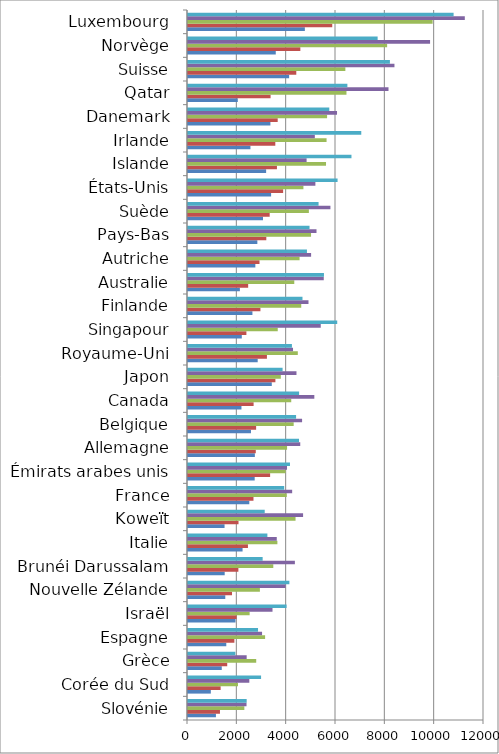
| Category | Series 0 | Series 1 | Series 2 | Series 3 | Series 4 |
|---|---|---|---|---|---|
| Slovénie | 1132.376 | 1296.104 | 2284.392 | 2372.633 | 2378.67 |
| Corée du Sud | 925.148 | 1323.165 | 2026.015 | 2486.071 | 2962.338 |
| Grèce | 1368.835 | 1590.054 | 2765.424 | 2378.302 | 1920.806 |
| Espagne | 1552.224 | 1880.104 | 3125.885 | 3002.596 | 2839.119 |
| Israël | 1925.207 | 1970.043 | 2498.858 | 3425.917 | 3996.221 |
| Nouvelle Zélande | 1511.457 | 1784.429 | 2914.877 | 3956.713 | 4110.66 |
| Brunéi Darussalam | 1487.866 | 2042.18 | 3457.921 | 4333.171 | 3026.523 |
| Italie | 2212.311 | 2430.632 | 3623.842 | 3598.587 | 3218.186 |
| Koweït | 1482.174 | 2047.66 | 4359.917 | 4665.524 | 3110.297 |
| France | 2485.644 | 2654.769 | 4004.505 | 4222.859 | 3899.702 |
| Émirats arabes unis | 2703.795 | 3329.504 | 3958.499 | 4013.92 | 4133.885 |
| Allemagne | 2710.429 | 2748.136 | 4016.432 | 4550.583 | 4500.836 |
| Belgique | 2552.636 | 2761.962 | 4284.321 | 4625.3 | 4381.613 |
| Canada | 2167.25 | 2659.819 | 4185.698 | 5121.322 | 4504.232 |
| Japon | 3396.655 | 3543.169 | 3762.531 | 4397.457 | 3834.738 |
| Royaume-Uni | 2825.391 | 3199.741 | 4451.992 | 4257.854 | 4212.807 |
| Singapour | 2181.009 | 2367.473 | 3638.353 | 5381.903 | 6049.715 |
| Finlande | 2611.791 | 2936.034 | 4590.96 | 4884.871 | 4641.347 |
| Australie | 2103.369 | 2439.374 | 4308.432 | 5504.047 | 5511.862 |
| Autriche | 2730.415 | 2899.424 | 4524.028 | 4990.832 | 4822.094 |
| Pays-Bas | 2811.243 | 3174.853 | 4988.293 | 5209.518 | 4927.248 |
| Suède | 3040.294 | 3311.63 | 4900.186 | 5774.091 | 5293.253 |
| États-Unis | 3368.847 | 3856.422 | 4678.963 | 5164.225 | 6064.248 |
| Islande | 3167.413 | 3605.75 | 5595.238 | 4808.129 | 6626.977 |
| Irlande | 2531.215 | 3539.679 | 5617.424 | 5141.619 | 7024.47 |
| Danemark | 3340.433 | 3636.311 | 5638.877 | 6041.586 | 5727.974 |
| Qatar | 2018.447 | 3347.982 | 6424.342 | 8128.266 | 6461.412 |
| Suisse | 4099.616 | 4389.872 | 6379.606 | 8369.595 | 8185.313 |
| Norvège | 3558.288 | 4554.459 | 8072.901 | 9813.601 | 7687.955 |
| Luxembourg | 4737.51 | 5847.989 | 9917.225 | 11222.041 | 10767.599 |